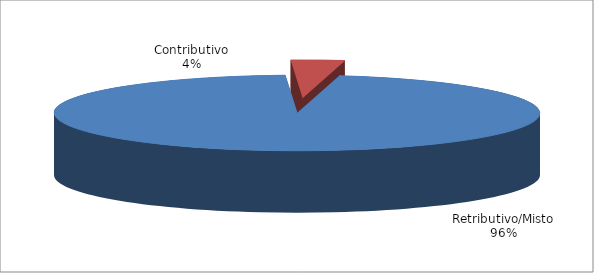
| Category | Series 1 |
|---|---|
| Retributivo/Misto | 27298 |
| Contributivo | 1006 |